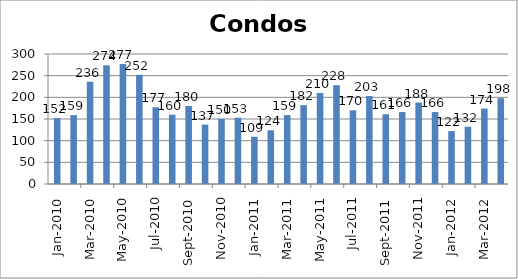
| Category | Series 0 |
|---|---|
| 2010-01-01 | 152 |
| 2010-02-01 | 159 |
| 2010-03-01 | 236 |
| 2010-04-01 | 274 |
| 2010-05-01 | 277 |
| 2010-06-01 | 252 |
| 2010-07-01 | 177 |
| 2010-08-01 | 160 |
| 2010-09-01 | 180 |
| 2010-10-01 | 137 |
| 2010-11-01 | 150 |
| 2010-12-01 | 153 |
| 2011-01-01 | 109 |
| 2011-02-01 | 124 |
| 2011-03-01 | 159 |
| 2011-04-01 | 182 |
| 2011-05-01 | 210 |
| 2011-06-01 | 228 |
| 2011-07-01 | 170 |
| 2011-08-01 | 203 |
| 2011-09-01 | 161 |
| 2011-10-01 | 166 |
| 2011-11-01 | 188 |
| 2011-12-01 | 166 |
| 2012-01-01 | 122 |
| 2012-02-01 | 132 |
| 2012-03-01 | 174 |
| 2012-04-01 | 198 |